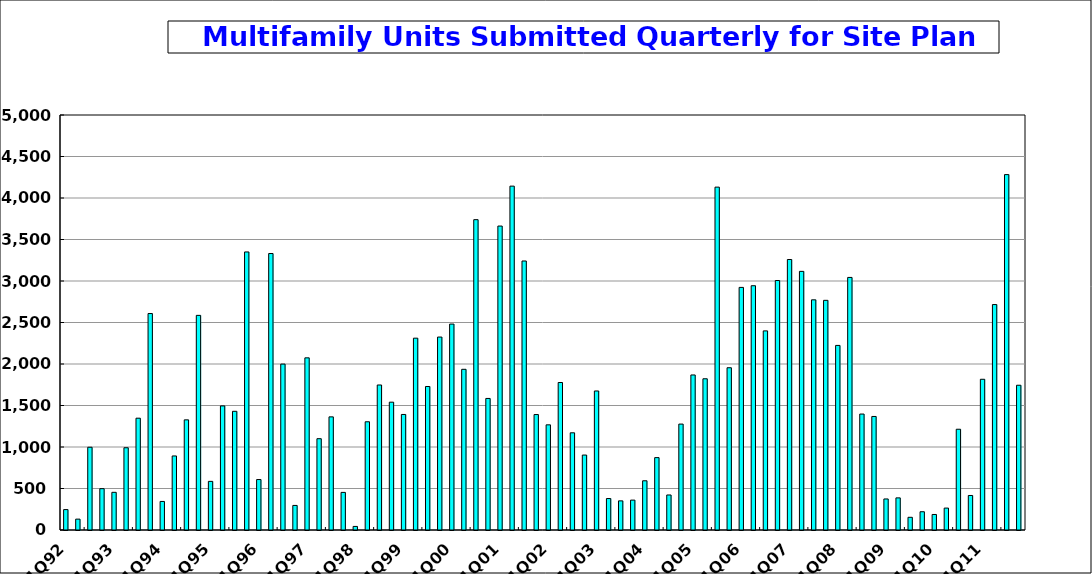
| Category | Series 0 |
|---|---|
| 1Q92 | 246 |
| 2Q92 | 131 |
| 3Q92 | 997 |
| 4Q92 | 498 |
| 1Q93 | 454 |
| 2Q93 | 991 |
| 3Q93 | 1347 |
| 4Q93 | 2608 |
| 1Q94 | 344 |
| 2Q94 | 892 |
| 3Q94 | 1327 |
| 4Q94 | 2586 |
| 1Q95 | 586 |
| 2Q95 | 1495 |
| 3Q95 | 1430 |
| 4Q95 | 3350 |
| 1Q96 | 608 |
| 2Q96 | 3331 |
| 3Q96 | 1999 |
| 4Q96 | 296 |
| 1Q97 | 2074 |
| 2Q97 | 1100 |
| 3Q97 | 1363 |
| 4Q97 | 453 |
| 1Q98 | 43 |
| 2Q98 | 1304 |
| 3Q98 | 1747 |
| 4Q98 | 1540 |
| 1Q99 | 1392 |
| 2Q99 | 2311 |
| 3Q99 | 1729 |
| 4Q99 | 2324.56 |
| 1Q00 | 2481 |
| 2Q00 | 1936 |
| 3Q00 | 3739 |
| 4Q00 | 1585 |
| 1Q01 | 3662 |
| 2Q01 | 4143 |
| 3Q01 | 3241 |
| 4Q01 | 1391 |
| 1Q02 | 1267 |
| 2Q02 | 1777 |
| 3Q02 | 1171 |
| 4Q02 | 903 |
| 1Q03 | 1675 |
| 2Q03 | 379 |
| 3Q03 | 351 |
| 4Q03 | 360 |
| 1Q04 | 593 |
| 2Q04 | 872 |
| 3Q04 | 422 |
| 4Q04 | 1276 |
| 1Q05 | 1868 |
| 2Q05 | 1822 |
| 3Q05 | 4131 |
| 4Q05 | 1955 |
| 1Q06 | 2923 |
| 2Q06 | 2943 |
| 3Q06 | 2399 |
| 4Q06 | 3006 |
| 1Q07 | 3259 |
| 2Q07 | 3116 |
| 3Q07 | 2773 |
| 4Q07 | 2767 |
| 1Q08 | 2224 |
| 2Q08 | 3043 |
| 3Q08 | 1397 |
| 4Q08 | 1368 |
| 1Q09 | 374 |
| 2Q09 | 387 |
| 3Q09 | 153 |
| 4Q09 | 220 |
| 1Q10 | 187 |
| 2Q10 | 264 |
| 3Q10 | 1214 |
| 4Q10 | 416 |
| 1Q11 | 1816 |
| 2Q11 | 2716 |
| 3Q11 | 4282 |
| 4Q11 | 1744 |